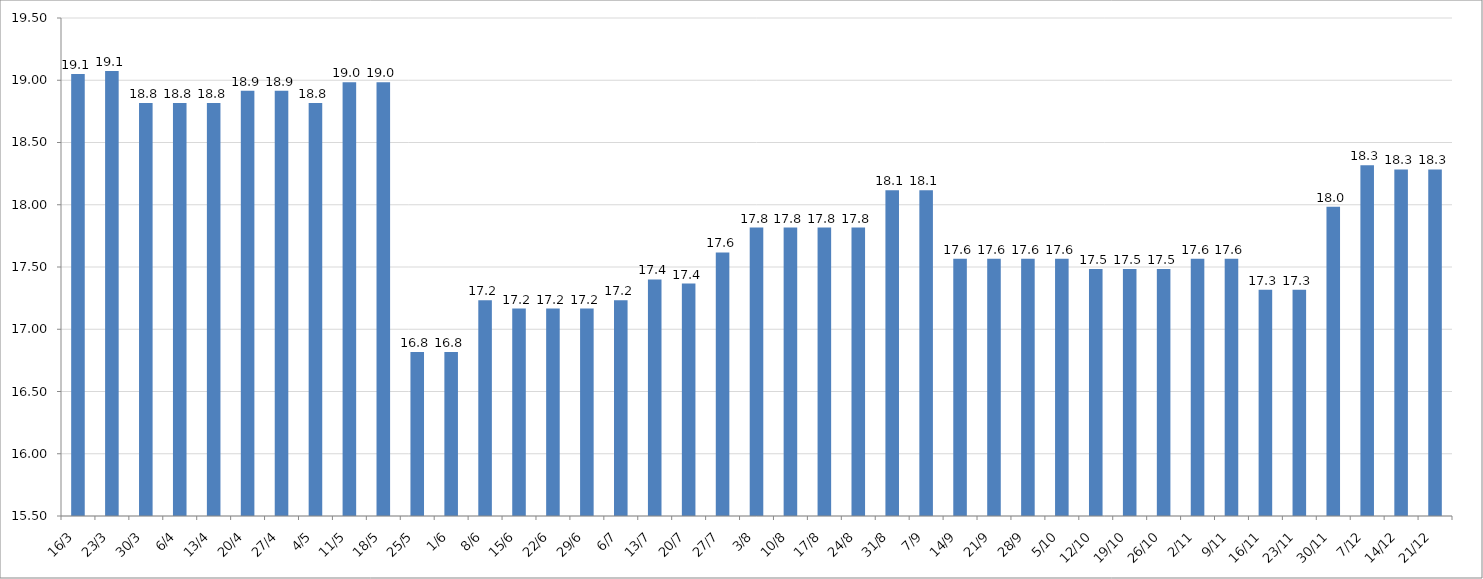
| Category | Series 0 |
|---|---|
| 2020-03-16 | 19.05 |
| 2020-03-23 | 19.075 |
| 2020-03-30 | 18.817 |
| 2020-04-06 | 18.817 |
| 2020-04-13 | 18.817 |
| 2020-04-20 | 18.917 |
| 2020-04-27 | 18.917 |
| 2020-05-04 | 18.817 |
| 2020-05-11 | 18.983 |
| 2020-05-18 | 18.983 |
| 2020-05-25 | 16.817 |
| 2020-06-01 | 16.817 |
| 2020-06-08 | 17.233 |
| 2020-06-15 | 17.167 |
| 2020-06-22 | 17.167 |
| 2020-06-29 | 17.167 |
| 2020-07-06 | 17.233 |
| 2020-07-13 | 17.4 |
| 2020-07-20 | 17.367 |
| 2020-07-27 | 17.617 |
| 2020-08-03 | 17.817 |
| 2020-08-10 | 17.817 |
| 2020-08-17 | 17.817 |
| 2020-08-24 | 17.817 |
| 2020-08-31 | 18.117 |
| 2020-09-07 | 18.117 |
| 2020-09-14 | 17.567 |
| 2020-09-21 | 17.567 |
| 2020-09-28 | 17.567 |
| 2020-10-05 | 17.567 |
| 2020-10-12 | 17.483 |
| 2020-10-19 | 17.483 |
| 2020-10-26 | 17.483 |
| 2020-11-02 | 17.567 |
| 2020-11-09 | 17.567 |
| 2020-11-16 | 17.317 |
| 2020-11-23 | 17.317 |
| 2020-11-30 | 17.983 |
| 2020-12-07 | 18.317 |
| 2020-12-14 | 18.283 |
| 2020-12-21 | 18.283 |